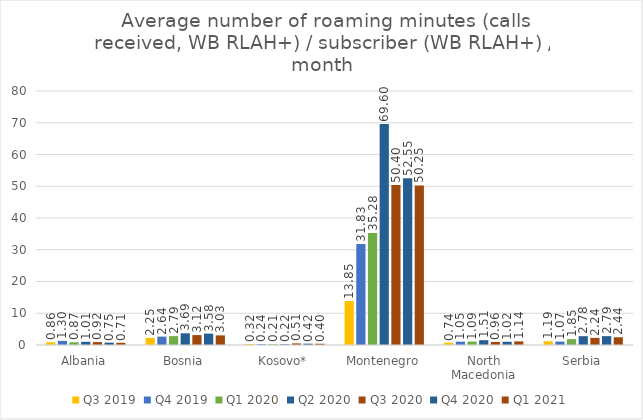
| Category | Q3 2019 | Q4 2019 | Q1 2020 | Q2 2020 | Q3 2020 | Q4 2020 | Q1 2021 |
|---|---|---|---|---|---|---|---|
| Albania | 0.859 | 1.301 | 0.869 | 1.007 | 0.916 | 0.749 | 0.711 |
| Bosnia | 2.254 | 2.644 | 2.793 | 3.686 | 3.116 | 3.579 | 3.032 |
| Kosovo* | 0.318 | 0.241 | 0.21 | 0.218 | 0.507 | 0.423 | 0.399 |
| Montenegro | 13.852 | 31.83 | 35.275 | 69.604 | 50.402 | 52.548 | 50.248 |
| North Macedonia | 0.737 | 1.05 | 1.086 | 1.513 | 0.956 | 1.02 | 1.141 |
| Serbia | 1.193 | 1.073 | 1.845 | 2.777 | 2.243 | 2.794 | 2.435 |